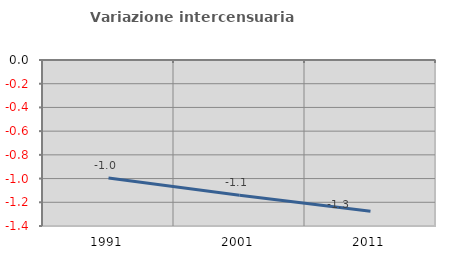
| Category | Variazione intercensuaria annua |
|---|---|
| 1991.0 | -0.994 |
| 2001.0 | -1.141 |
| 2011.0 | -1.275 |